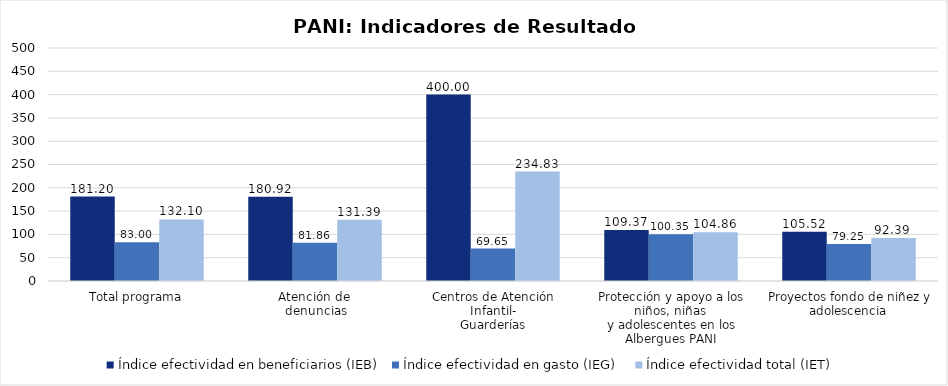
| Category | Índice efectividad en beneficiarios (IEB) | Índice efectividad en gasto (IEG)  | Índice efectividad total (IET) |
|---|---|---|---|
| Total programa | 181.199 | 82.995 | 132.097 |
| Atención de 
denuncias | 180.921 | 81.863 | 131.392 |
| Centros de Atención Infantil-
Guarderías | 400 | 69.654 | 234.827 |
| Protección y apoyo a los niños, niñas 
y adolescentes en los Albergues PANI | 109.366 | 100.353 | 104.859 |
| Proyectos fondo de niñez y adolescencia  | 105.52 | 79.251 | 92.385 |